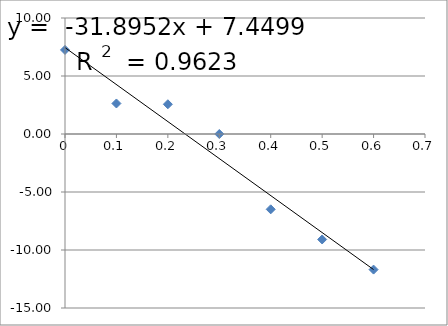
| Category | % de cambio (Pf-Pi/Pi %) |
|---|---|
| 0.0 | 7.246 |
| 0.1 | 2.632 |
| 0.2 | 2.564 |
| 0.3 | 0 |
| 0.4 | -6.494 |
| 0.5 | -9.091 |
| 0.6 | -11.688 |